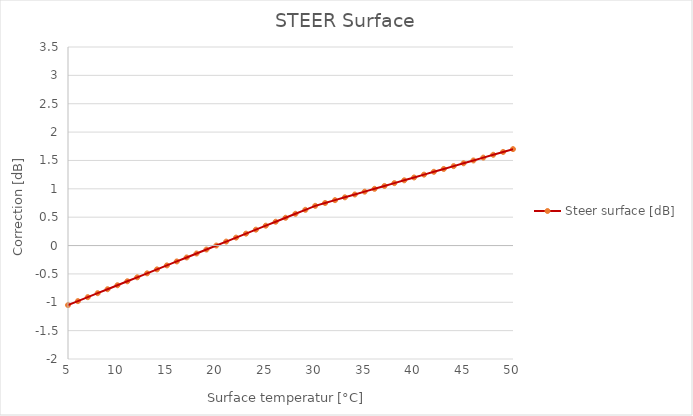
| Category | Steer surface [dB] |
|---|---|
| 5.0 | -1.05 |
| 6.0 | -0.98 |
| 7.0 | -0.91 |
| 8.0 | -0.84 |
| 9.0 | -0.77 |
| 10.0 | -0.7 |
| 11.0 | -0.63 |
| 12.0 | -0.56 |
| 13.0 | -0.49 |
| 14.0 | -0.42 |
| 15.0 | -0.35 |
| 16.0 | -0.28 |
| 17.0 | -0.21 |
| 18.0 | -0.14 |
| 19.0 | -0.07 |
| 20.0 | 0 |
| 21.0 | 0.07 |
| 22.0 | 0.14 |
| 23.0 | 0.21 |
| 24.0 | 0.28 |
| 25.0 | 0.35 |
| 26.0 | 0.42 |
| 27.0 | 0.49 |
| 28.0 | 0.56 |
| 29.0 | 0.63 |
| 30.0 | 0.7 |
| 31.0 | 0.75 |
| 32.0 | 0.8 |
| 33.0 | 0.85 |
| 34.0 | 0.9 |
| 35.0 | 0.95 |
| 36.0 | 1 |
| 37.0 | 1.05 |
| 38.0 | 1.1 |
| 39.0 | 1.15 |
| 40.0 | 1.2 |
| 41.0 | 1.25 |
| 42.0 | 1.3 |
| 43.0 | 1.35 |
| 44.0 | 1.4 |
| 45.0 | 1.45 |
| 46.0 | 1.5 |
| 47.0 | 1.55 |
| 48.0 | 1.6 |
| 49.0 | 1.65 |
| 50.0 | 1.7 |